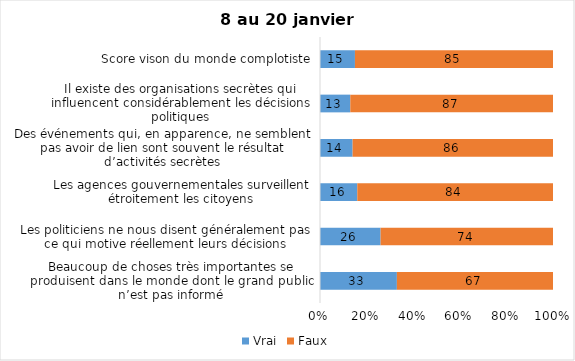
| Category | Vrai | Faux |
|---|---|---|
| Beaucoup de choses très importantes se produisent dans le monde dont le grand public n’est pas informé | 33 | 67 |
| Les politiciens ne nous disent généralement pas ce qui motive réellement leurs décisions | 26 | 74 |
| Les agences gouvernementales surveillent étroitement les citoyens | 16 | 84 |
| Des événements qui, en apparence, ne semblent pas avoir de lien sont souvent le résultat d’activités secrètes | 14 | 86 |
| Il existe des organisations secrètes qui influencent considérablement les décisions politiques | 13 | 87 |
| Score vison du monde complotiste | 15 | 85 |